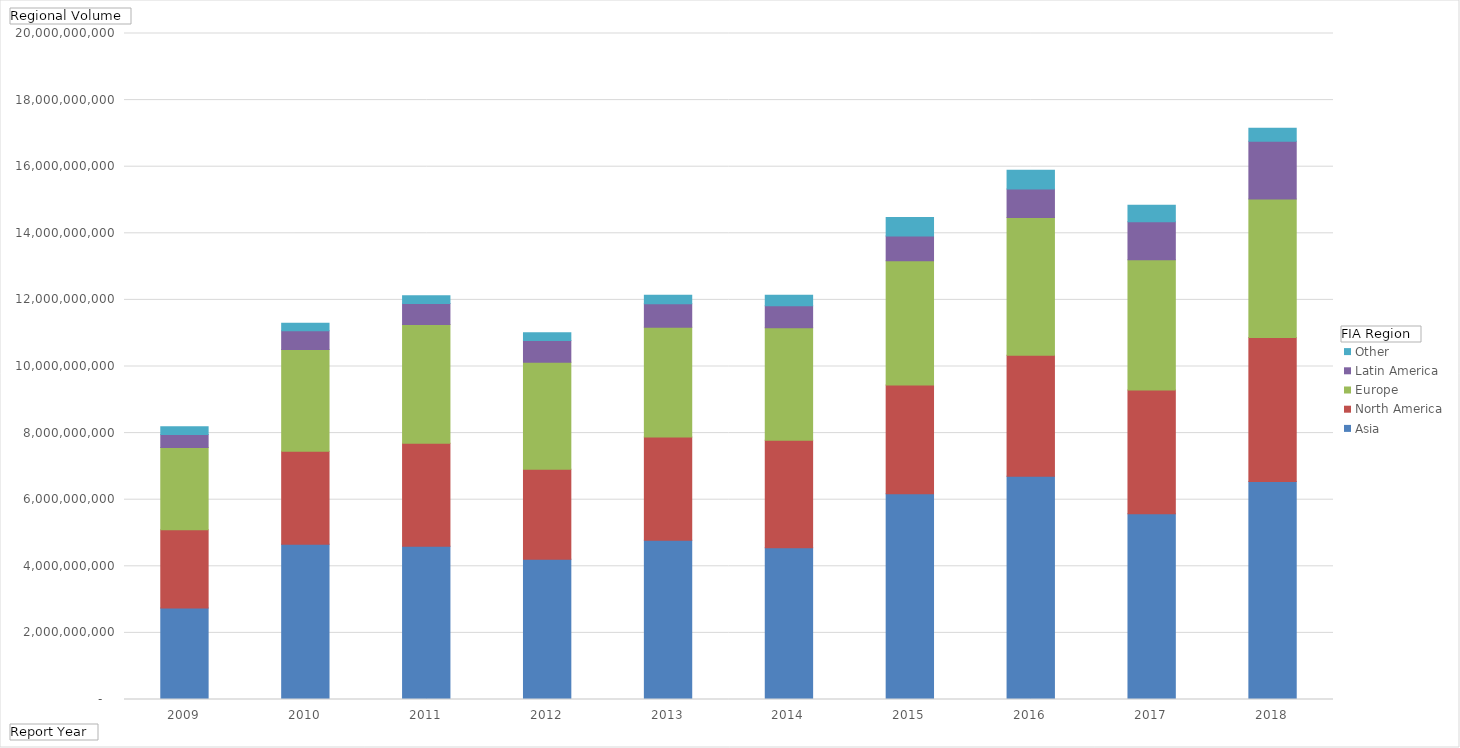
| Category | Asia | North America | Europe | Latin America | Other |
|---|---|---|---|---|---|
| 2009 | 2746674401 | 2348681682 | 2471115054 | 389387899 | 232774056 |
| 2010 | 4658651353 | 2793080732 | 3055171929 | 569112144 | 222157848 |
| 2011 | 4598841248 | 3093024305 | 3571389060 | 626548686 | 232327626 |
| 2012 | 4208458100 | 2705832896 | 3215201580 | 651538873 | 230455275 |
| 2013 | 4778544618 | 3105631692 | 3295037219 | 704279509 | 252496472 |
| 2014 | 4558238960 | 3224732788 | 3382523321 | 659254072 | 316126807 |
| 2015 | 6177556892 | 3267219270 | 3734547947 | 736780599 | 562090158 |
| 2016 | 6702591250 | 3632906902 | 4137966907 | 855780606 | 562847971 |
| 2017 | 5574573372 | 3717425728 | 3912090442 | 1139961390 | 498702236 |
| 2018 | 6549420988 | 4319808749 | 4164332007 | 1730020704 | 387736949 |